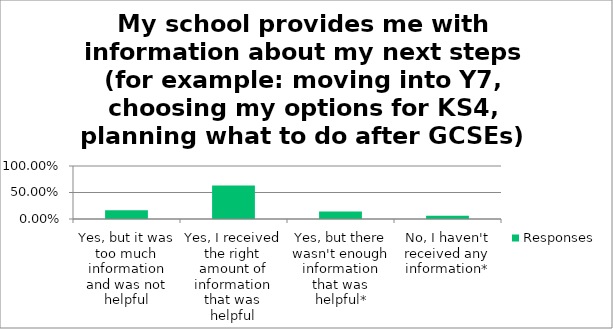
| Category | Responses |
|---|---|
| Yes, but it was too much information and was not helpful | 0.163 |
| Yes, I received the right amount of information that was helpful | 0.63 |
| Yes, but there wasn't enough information that was helpful* | 0.143 |
| No, I haven't received any information* | 0.063 |